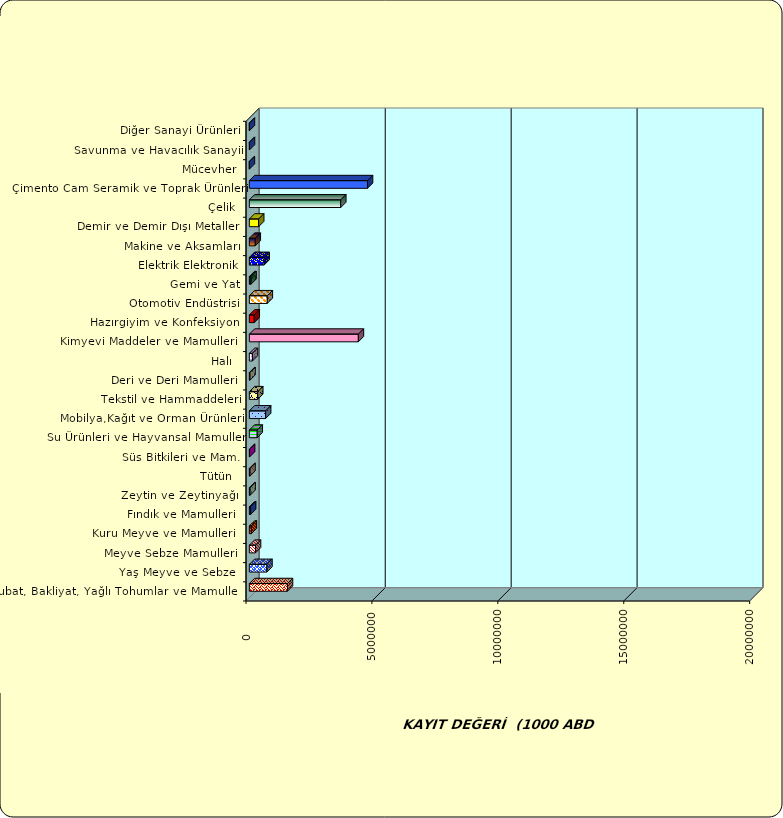
| Category | Series 0 |
|---|---|
|  Hububat, Bakliyat, Yağlı Tohumlar ve Mamulleri  | 1513776.691 |
|  Yaş Meyve ve Sebze   | 697680.433 |
|  Meyve Sebze Mamulleri  | 244491.429 |
|  Kuru Meyve ve Mamulleri   | 78427.272 |
|  Fındık ve Mamulleri  | 49816.268 |
|  Zeytin ve Zeytinyağı  | 28359.034 |
|  Tütün  | 25109.09 |
|  Süs Bitkileri ve Mam. | 9563.848 |
|  Su Ürünleri ve Hayvansal Mamuller | 312402.177 |
|  Mobilya,Kağıt ve Orman Ürünleri | 645926.217 |
|  Tekstil ve Hammaddeleri | 332154.246 |
|  Deri ve Deri Mamulleri  | 26320.698 |
|  Halı  | 122894.367 |
|  Kimyevi Maddeler ve Mamulleri   | 4329075.798 |
|  Hazırgiyim ve Konfeksiyon  | 193201.44 |
|  Otomotiv Endüstrisi | 712719.697 |
|  Gemi ve Yat | 66277.501 |
|  Elektrik Elektronik | 586603.233 |
|  Makine ve Aksamları | 234196.856 |
|  Demir ve Demir Dışı Metaller  | 369438.232 |
|  Çelik | 3629591.64 |
|  Çimento Cam Seramik ve Toprak Ürünleri | 4691849.297 |
|  Mücevher | 1032.587 |
|  Savunma ve Havacılık Sanayii | 5154.559 |
|  Diğer Sanayi Ürünleri | 2679.772 |